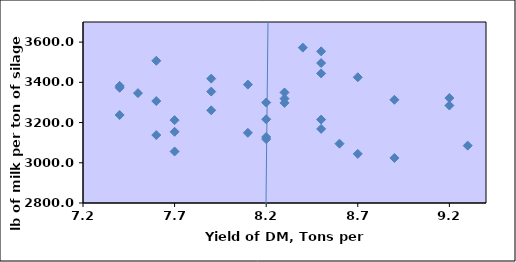
| Category | Series 0 |
|---|---|
| 7.6 | 3307 |
| 7.4 | 3382.5 |
| 7.5 | 3346.3 |
| 8.3 | 3319 |
| 8.5 | 3495.8 |
| 9.2 | 3322 |
| 8.1 | 3388.7 |
| 8.4 | 3572.8 |
| 8.5 | 3444.3 |
| 8.3 | 3349.5 |
| 8.7 | 3425.3 |
| 8.2 | 3117.5 |
| 9.2 | 3284.75 |
| 8.9 | 3313.25 |
| 7.9 | 3354 |
| 8.2 | 3299.5 |
| 7.9 | 3261 |
| 7.4 | 3237.5 |
| 7.7 | 3056.25 |
| 8.6 | 3095 |
| 8.5 | 3168.5 |
| 8.3 | 3297.75 |
| 7.7 | 3154 |
| 7.6 | 3138 |
| 8.9 | 3024 |
| 7.7 | 3212 |
| 8.1 | 3148.75 |
| 7.9 | 3418.5 |
| 8.5 | 3554 |
| 8.5 | 3214.75 |
| 8.2 | 3128.25 |
| 7.4 | 3373 |
| 7.6 | 3507.3 |
| 9.3 | 3085.333 |
| 8.2 | 3216.25 |
| 8.7 | 3044.25 |